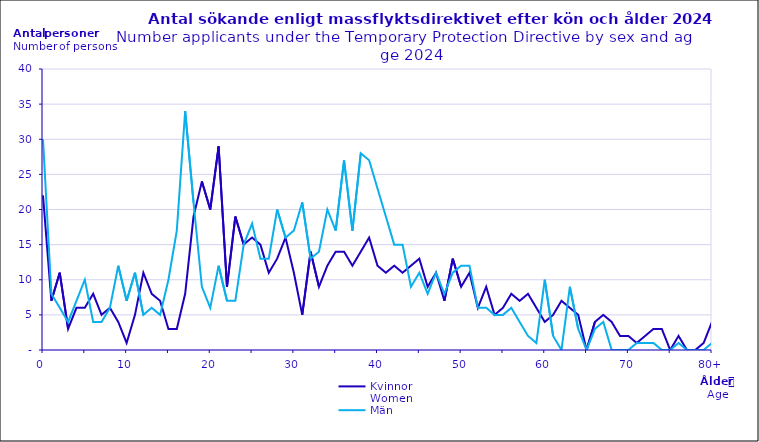
| Category | Kvinnor
Women | Män
Men |
|---|---|---|
| 0 | 22 | 30 |
| 1 | 7 | 8 |
| 2 | 11 | 6 |
| 3 | 3 | 4 |
| 4 | 6 | 7 |
| 5 | 6 | 10 |
| 6 | 8 | 4 |
| 7 | 5 | 4 |
| 8 | 6 | 6 |
| 9 | 4 | 12 |
| 10 | 1 | 7 |
| 11 | 5 | 11 |
| 12 | 11 | 5 |
| 13 | 8 | 6 |
| 14 | 7 | 5 |
| 15 | 3 | 10 |
| 16 | 3 | 17 |
| 17 | 8 | 34 |
| 18 | 19 | 21 |
| 19 | 24 | 9 |
| 20 | 20 | 6 |
| 21 | 29 | 12 |
| 22 | 9 | 7 |
| 23 | 19 | 7 |
| 24 | 15 | 15 |
| 25 | 16 | 18 |
| 26 | 15 | 13 |
| 27 | 11 | 13 |
| 28 | 13 | 20 |
| 29 | 16 | 16 |
| 30 | 11 | 17 |
| 31 | 5 | 21 |
| 32 | 14 | 13 |
| 33 | 9 | 14 |
| 34 | 12 | 20 |
| 35 | 14 | 17 |
| 36 | 14 | 27 |
| 37 | 12 | 17 |
| 38 | 14 | 28 |
| 39 | 16 | 27 |
| 40 | 12 | 23 |
| 41 | 11 | 19 |
| 42 | 12 | 15 |
| 43 | 11 | 15 |
| 44 | 12 | 9 |
| 45 | 13 | 11 |
| 46 | 9 | 8 |
| 47 | 11 | 11 |
| 48 | 7 | 8 |
| 49 | 13 | 11 |
| 50 | 9 | 12 |
| 51 | 11 | 12 |
| 52 | 6 | 6 |
| 53 | 9 | 6 |
| 54 | 5 | 5 |
| 55 | 6 | 5 |
| 56 | 8 | 6 |
| 57 | 7 | 4 |
| 58 | 8 | 2 |
| 59 | 6 | 1 |
| 60 | 4 | 10 |
| 61 | 5 | 2 |
| 62 | 7 | 0 |
| 63 | 6 | 9 |
| 64 | 5 | 3 |
| 65 | 0 | 0 |
| 66 | 4 | 3 |
| 67 | 5 | 4 |
| 68 | 4 | 0 |
| 69 | 2 | 0 |
| 70 | 2 | 0 |
| 71 | 1 | 1 |
| 72 | 2 | 1 |
| 73 | 3 | 1 |
| 74 | 3 | 0 |
| 75 | 0 | 0 |
| 76 | 2 | 1 |
| 77 | 0 | 0 |
| 78 | 0 | 0 |
| 79 | 1 | 0 |
| 80+ | 4 | 1 |